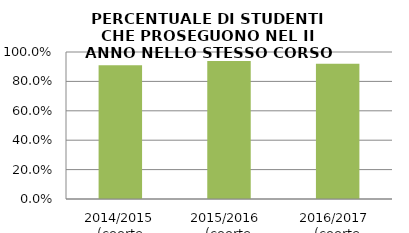
| Category | 2014/2015 (coorte 2013/14) 2015/2016  (coorte 2014/15) 2016/2017  (coorte 2015/16) |
|---|---|
| 2014/2015 (coorte 2013/14) | 0.909 |
| 2015/2016  (coorte 2014/15) | 0.94 |
| 2016/2017  (coorte 2015/16) | 0.92 |